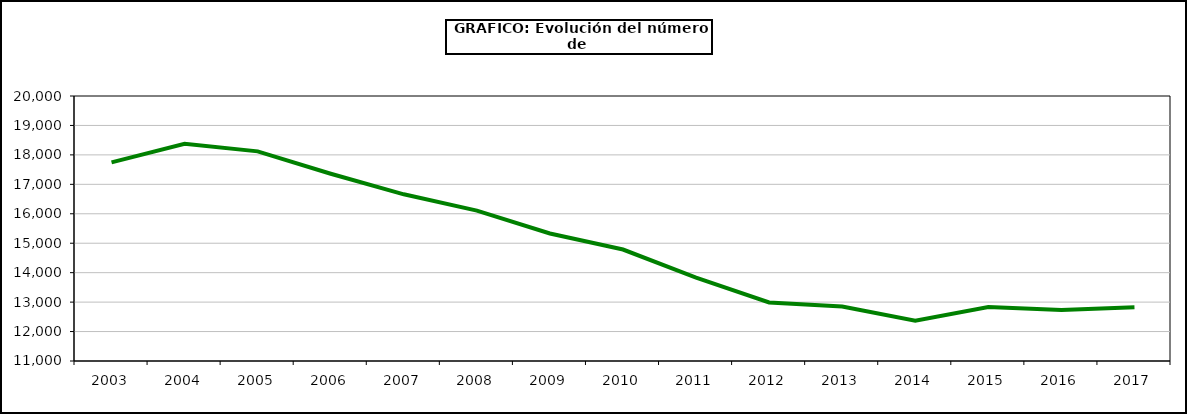
| Category | Lana |
|---|---|
| 2003.0 | 17744.754 |
| 2004.0 | 18373.709 |
| 2005.0 | 18119.109 |
| 2006.0 | 17360.572 |
| 2007.0 | 16660.647 |
| 2008.0 | 16105.475 |
| 2009.0 | 15330.854 |
| 2010.0 | 14786 |
| 2011.0 | 13830.488 |
| 2012.0 | 12986.682 |
| 2013.0 | 12849.185 |
| 2014.0 | 12369.399 |
| 2015.0 | 12834.9 |
| 2016.0 | 12731.005 |
| 2017.0 | 12825.033 |